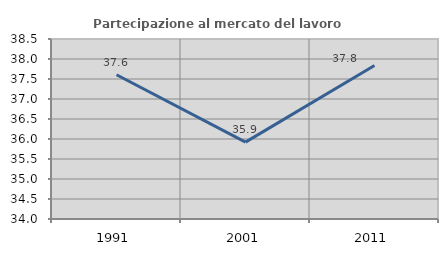
| Category | Partecipazione al mercato del lavoro  femminile |
|---|---|
| 1991.0 | 37.607 |
| 2001.0 | 35.922 |
| 2011.0 | 37.838 |